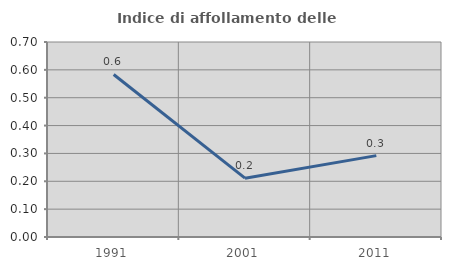
| Category | Indice di affollamento delle abitazioni  |
|---|---|
| 1991.0 | 0.583 |
| 2001.0 | 0.211 |
| 2011.0 | 0.292 |